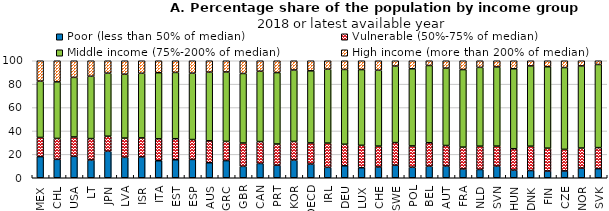
| Category | Poor (less than 50% of median) | Vulnerable (50%-75% of median) | Middle income (75%-200% of median) | High income (more than 200% of median) |
|---|---|---|---|---|
| MEX | 18.042 | 16.404 | 48.114 | 17.44 |
| CHL | 15.74 | 17.856 | 48.357 | 18.046 |
| USA | 18.333 | 16.525 | 50.949 | 14.193 |
| LT | 15.166 | 18.312 | 53.288 | 13.233 |
| JPN | 22.612 | 12.881 | 53.908 | 10.599 |
| LVA | 17.465 | 16.429 | 54.624 | 11.482 |
| ISR | 17.81 | 16.259 | 55.225 | 10.706 |
| ITA | 14.54 | 18.754 | 56.463 | 10.242 |
| EST | 15.401 | 17.953 | 56.663 | 9.983 |
| ESP | 15.669 | 16.986 | 56.75 | 10.595 |
| AUS | 12.822 | 18.761 | 58.7 | 9.717 |
| GRC | 14.651 | 16.42 | 59.343 | 9.586 |
| GBR | 9.726 | 19.956 | 59.436 | 10.882 |
| CAN | 12.213 | 18.741 | 60.121 | 8.925 |
| PRT | 10.733 | 18.1 | 61.056 | 10.111 |
| KOR | 15.135 | 15.918 | 61.056 | 7.89 |
| OECD | 11.748 | 18.033 | 61.618 | 8.601 |
| IRL | 8.903 | 20.708 | 63.177 | 7.211 |
| DEU | 10.238 | 18.384 | 63.946 | 7.433 |
| LUX | 8.6 | 19.135 | 64.729 | 7.536 |
| CHE | 9.237 | 17.812 | 64.894 | 8.056 |
| SWE | 10.76 | 19.282 | 65.404 | 4.553 |
| POL | 9.048 | 18.154 | 65.927 | 6.871 |
| BEL | 9.835 | 20.074 | 66.032 | 4.059 |
| AUT | 10.002 | 17.562 | 66.145 | 6.291 |
| FRA | 7.492 | 18.702 | 66.27 | 7.536 |
| NLD | 7.073 | 19.92 | 67.35 | 5.657 |
| SVN | 9.915 | 17.118 | 67.683 | 5.284 |
| HUN | 6.605 | 18.197 | 68.374 | 6.825 |
| DNK | 6.193 | 20.784 | 68.617 | 4.406 |
| FIN | 5.79 | 19.498 | 69.615 | 5.097 |
| CZE | 5.871 | 18.407 | 69.917 | 5.805 |
| NOR | 8.281 | 17.121 | 70.206 | 4.393 |
| SVK | 7.78 | 17.974 | 71.054 | 3.192 |